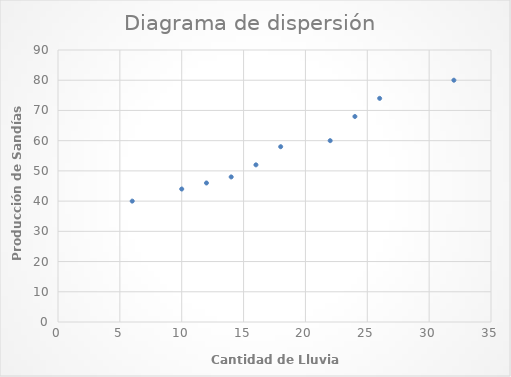
| Category | Series 0 |
|---|---|
| 6.0 | 40 |
| 10.0 | 44 |
| 12.0 | 46 |
| 14.0 | 48 |
| 16.0 | 52 |
| 18.0 | 58 |
| 22.0 | 60 |
| 24.0 | 68 |
| 26.0 | 74 |
| 32.0 | 80 |